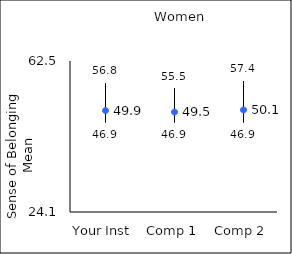
| Category | 25th percentile | 75th percentile | Mean |
|---|---|---|---|
| Your Inst | 46.9 | 56.8 | 49.89 |
| Comp 1 | 46.9 | 55.5 | 49.51 |
| Comp 2 | 46.9 | 57.4 | 50.05 |